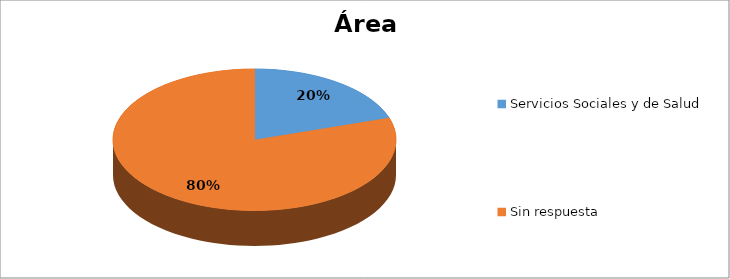
| Category | Series 0 |
|---|---|
| Servicios Sociales y de Salud | 0.2 |
| Sin respuesta | 0.8 |